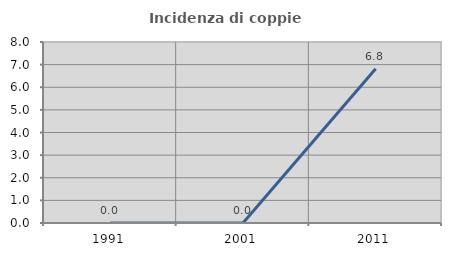
| Category | Incidenza di coppie miste |
|---|---|
| 1991.0 | 0 |
| 2001.0 | 0 |
| 2011.0 | 6.818 |